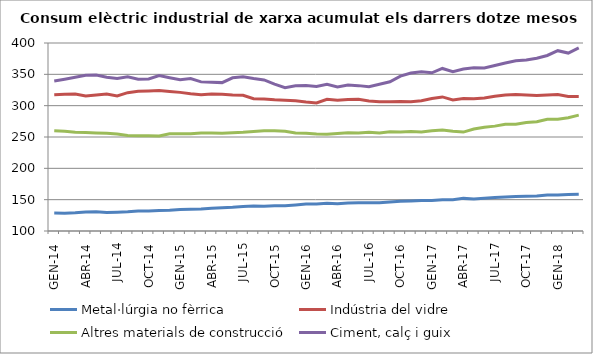
| Category | Metal·lúrgia no fèrrica | Indústria del vidre | Altres materials de construcció | Ciment, calç i guix |
|---|---|---|---|---|
| GEN-14 | 128.874 | 317.43 | 260.119 | 339.523 |
| FEB-14 | 128.471 | 318.122 | 259.291 | 342.273 |
| MAR-14 | 128.991 | 318.585 | 257.733 | 345.262 |
| ABR-14 | 130.166 | 315.391 | 257.331 | 348.496 |
| MAI-14 | 130.654 | 316.912 | 256.483 | 348.755 |
| JUN-14 | 129.511 | 318.615 | 256.006 | 345.424 |
| JUL-14 | 130.05 | 315.38 | 254.72 | 343.304 |
| AGO-14 | 130.735 | 320.736 | 252.465 | 346.004 |
| SET-14 | 131.82 | 322.83 | 252.16 | 342.026 |
| OCT-14 | 131.97 | 323.549 | 251.938 | 342.609 |
| NOV-14 | 132.89 | 324.246 | 251.738 | 348.182 |
| DES-14 | 133.122 | 322.653 | 255.098 | 344.672 |
| GEN-15 | 134.416 | 321.219 | 255.301 | 341.378 |
| FEB-15 | 134.569 | 319.151 | 255.379 | 343.233 |
| MAR-15 | 134.997 | 317.513 | 256.524 | 337.963 |
| ABR-15 | 136.292 | 318.738 | 256.421 | 337.263 |
| MAI-15 | 137.074 | 318.189 | 256.092 | 336.777 |
| JUN-15 | 137.877 | 317.071 | 256.789 | 344.511 |
| JUL-15 | 139.104 | 316.582 | 257.476 | 345.975 |
| AGO-15 | 139.79 | 311.153 | 258.951 | 343.288 |
| SET-15 | 139.451 | 310.821 | 259.786 | 341.022 |
| OCT-15 | 140.48 | 309.307 | 260.126 | 334.494 |
| NOV-15 | 140.456 | 308.76 | 259.091 | 328.693 |
| DES-15 | 141.674 | 307.714 | 256.306 | 331.92 |
| GEN-16 | 142.986 | 305.805 | 256.057 | 332.134 |
| FEB-16 | 143.171 | 304.429 | 254.655 | 330.545 |
| MAR-16 | 144.306 | 310.3 | 254.26 | 334.076 |
| ABR-16 | 143.406 | 308.753 | 255.56 | 329.802 |
| MAI-16 | 144.766 | 309.871 | 256.935 | 332.798 |
| JUN-16 | 145.022 | 310.119 | 256.201 | 331.974 |
| JUL-16 | 145.247 | 307.398 | 257.516 | 330.341 |
| AGO-16 | 145.186 | 306.096 | 256.45 | 334.161 |
| SET-16 | 146.461 | 306.167 | 258.332 | 338.118 |
| OCT-16 | 147.621 | 306.58 | 257.833 | 347.113 |
| NOV-16 | 147.99 | 306.321 | 258.82 | 352.02 |
| DES-16 | 148.68 | 307.872 | 258.037 | 354.02 |
| GEN-17 | 148.54 | 311.305 | 259.823 | 352.396 |
| FEB-17 | 150.002 | 313.967 | 261.177 | 359.388 |
| MAR-17 | 150.043 | 309.24 | 259.16 | 354.378 |
| ABR-17 | 152.052 | 311.409 | 257.809 | 358.606 |
| MAI-17 | 150.931 | 311.138 | 262.835 | 360.471 |
| JUN-17 | 152.354 | 312.357 | 265.384 | 360.203 |
| JUL-17 | 153.409 | 315.168 | 267.35 | 364.181 |
| AGO-17 | 154.243 | 317.164 | 270.467 | 368.086 |
| SET-17 | 155.08 | 317.762 | 270.388 | 371.816 |
| OCT-17 | 155.384 | 317.158 | 273.04 | 372.976 |
| NOV-17 | 155.961 | 316.39 | 274.279 | 375.758 |
| DES-17 | 157.544 | 317.139 | 278.385 | 380.086 |
| GEN-18 | 157.419 | 317.7 | 278.292 | 387.766 |
| FEB-18 | 158.148 | 314.735 | 280.681 | 383.961 |
| MAR-18 | 158.725 | 314.702 | 284.912 | 392.275 |